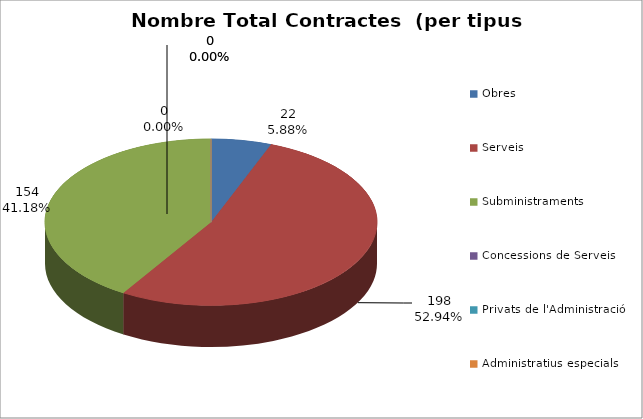
| Category | Nombre Total Contractes |
|---|---|
| Obres | 22 |
| Serveis | 198 |
| Subministraments | 154 |
| Concessions de Serveis | 0 |
| Privats de l'Administració | 0 |
| Administratius especials | 0 |